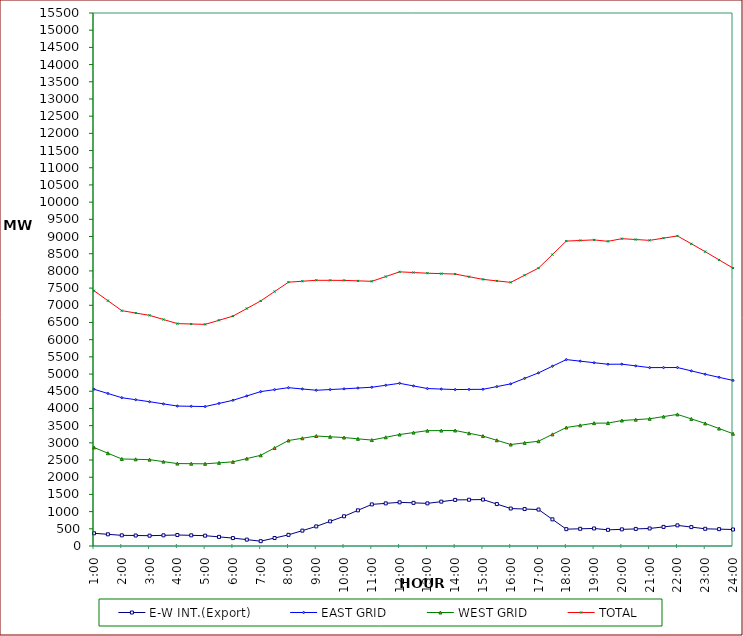
| Category | E-W INT.(Export) | EAST GRID | WEST GRID | TOTAL |
|---|---|---|---|---|
| 1:00 | 370 | 4558 | 2865 | 7423 |
| 1:30 | 340 | 4435.5 | 2698 | 7133.5 |
| 2:00 | 310 | 4313 | 2531 | 6844 |
| 2:30 | 305 | 4254.5 | 2521 | 6775.5 |
| 3:00 | 300 | 4196 | 2511 | 6707 |
| 3:30 | 310 | 4133 | 2454 | 6587 |
| 4:00 | 320 | 4070 | 2397 | 6467 |
| 4:30 | 310 | 4062.5 | 2393.5 | 6456 |
| 5:00 | 300 | 4055 | 2390 | 6445 |
| 5:30 | 265 | 4146 | 2418.5 | 6564.5 |
| 6:00 | 230 | 4237 | 2447 | 6684 |
| 6:30 | 185 | 4363.5 | 2542 | 6905.5 |
| 7:00 | 140 | 4490 | 2637 | 7127 |
| 7:30 | 232 | 4547 | 2852.5 | 7399.5 |
| 8:00 | 324 | 4604 | 3068 | 7672 |
| 8:30 | 447 | 4566.5 | 3133 | 7699.5 |
| 9:00 | 570 | 4529 | 3198 | 7727 |
| 9:30 | 717 | 4549.5 | 3176 | 7725.5 |
| 10:00 | 864 | 4570 | 3154 | 7724 |
| 10:30 | 1037 | 4593.5 | 3117 | 7710.5 |
| 11:00 | 1210 | 4617 | 3080 | 7697 |
| 11:30 | 1240 | 4674 | 3161 | 7835 |
| 12:00 | 1270 | 4731 | 3242 | 7973 |
| 12:30 | 1255 | 4655 | 3298 | 7953 |
| 13:00 | 1240 | 4579 | 3354 | 7933 |
| 13:30 | 1290 | 4564 | 3356.5 | 7920.5 |
| 14:00 | 1340 | 4549 | 3359 | 7908 |
| 14:30 | 1345 | 4553 | 3278 | 7831 |
| 15:00 | 1350 | 4557 | 3197 | 7754 |
| 15:30 | 1220 | 4636 | 3074 | 7710 |
| 16:00 | 1090 | 4715 | 2951 | 7666 |
| 16:30 | 1075 | 4875 | 2999 | 7874 |
| 17:00 | 1060 | 5035 | 3047 | 8082 |
| 17:30 | 775 | 5228 | 3246.5 | 8474.5 |
| 18:00 | 490 | 5421 | 3446 | 8867 |
| 18:30 | 500 | 5375.5 | 3509 | 8884.5 |
| 19:00 | 510 | 5330 | 3572 | 8902 |
| 19:30 | 470 | 5285 | 3575 | 8860 |
| 20:00 | 484 | 5288 | 3649 | 8937 |
| 20:30 | 497 | 5238 | 3674.5 | 8912.5 |
| 21:00 | 510 | 5188 | 3700 | 8888 |
| 21:30 | 555 | 5189 | 3763.5 | 8952.5 |
| 22:00 | 600 | 5190 | 3827 | 9017 |
| 22:30 | 550 | 5092.5 | 3696 | 8788.5 |
| 23:00 | 500 | 4995 | 3565 | 8560 |
| 23:30 | 490 | 4905 | 3415.5 | 8320.5 |
| 24:00 | 480 | 4815 | 3266 | 8081 |